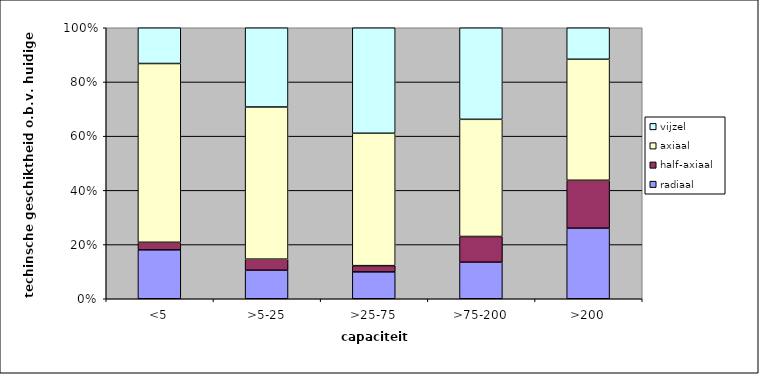
| Category | radiaal | half-axiaal | axiaal | vijzel |
|---|---|---|---|---|
| <5 | 0.181 | 0.028 | 0.66 | 0.132 |
| >5-25 | 0.105 | 0.041 | 0.561 | 0.292 |
| >25-75 | 0.099 | 0.023 | 0.489 | 0.389 |
| >75-200 | 0.135 | 0.095 | 0.432 | 0.338 |
| >200 | 0.26 | 0.177 | 0.447 | 0.116 |